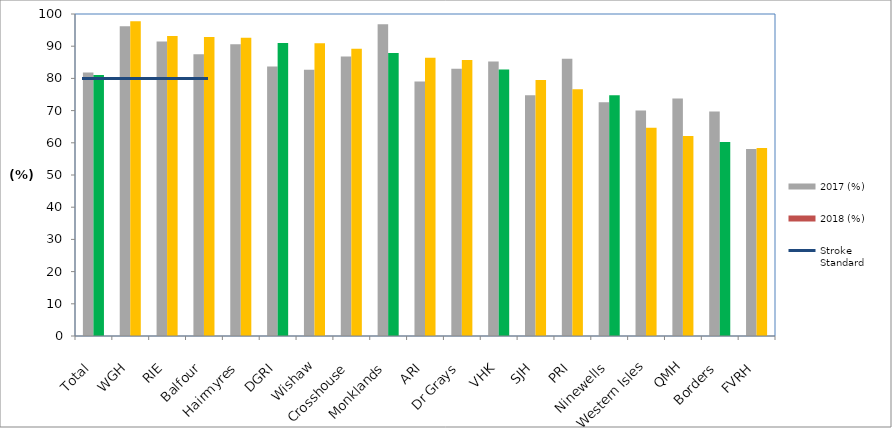
| Category | 2017 (%) | 2018 (%) |
|---|---|---|
| Total | 81.853 | 81.073 |
| WGH | 96.205 | 97.732 |
| RIE | 91.469 | 93.162 |
| Balfour | 87.5 | 92.857 |
| Hairmyres | 90.625 | 92.614 |
| DGRI | 83.688 | 90.977 |
| Wishaw | 82.677 | 90.909 |
| Crosshouse | 86.798 | 89.213 |
| Monklands | 96.855 | 87.898 |
| ARI | 79.01 | 86.441 |
| Dr Grays | 82.979 | 85.714 |
| VHK | 85.214 | 82.727 |
| SJH | 74.747 | 79.487 |
| PRI | 86.093 | 76.613 |
| Ninewells | 72.609 | 74.771 |
| Western Isles | 70 | 64.706 |
| QMH | 73.743 | 62.092 |
| Borders | 69.753 | 60.265 |
| FVRH | 58.039 | 58.369 |